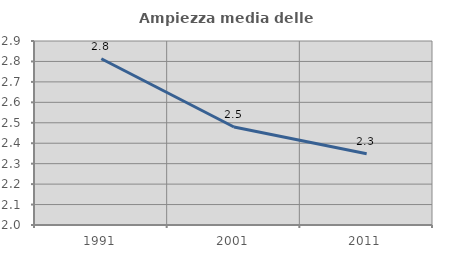
| Category | Ampiezza media delle famiglie |
|---|---|
| 1991.0 | 2.813 |
| 2001.0 | 2.479 |
| 2011.0 | 2.349 |